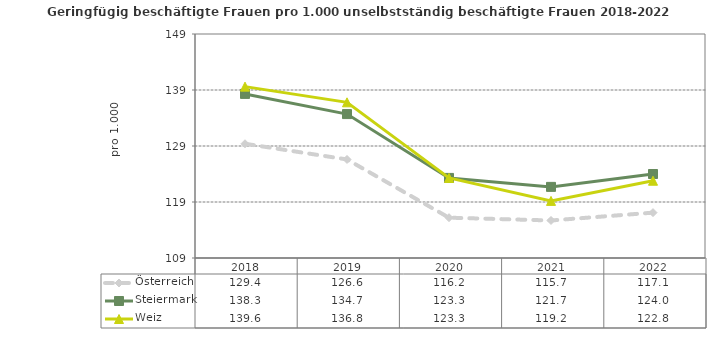
| Category | Österreich | Steiermark | Weiz |
|---|---|---|---|
| 2022.0 | 117.1 | 124 | 122.8 |
| 2021.0 | 115.7 | 121.7 | 119.2 |
| 2020.0 | 116.2 | 123.3 | 123.3 |
| 2019.0 | 126.6 | 134.7 | 136.8 |
| 2018.0 | 129.4 | 138.3 | 139.6 |